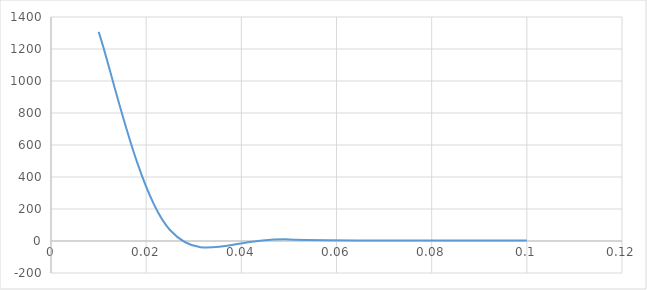
| Category | Series 0 |
|---|---|
| 0.01 | 1307 |
| 0.025 | 69 |
| 0.05 | 9.883 |
| 0.1 | 2.783 |